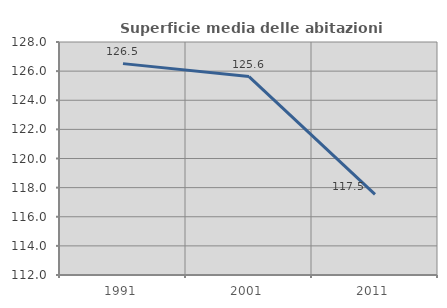
| Category | Superficie media delle abitazioni occupate |
|---|---|
| 1991.0 | 126.515 |
| 2001.0 | 125.626 |
| 2011.0 | 117.537 |